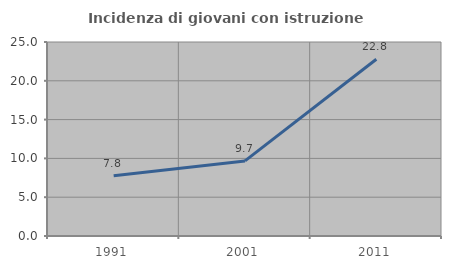
| Category | Incidenza di giovani con istruzione universitaria |
|---|---|
| 1991.0 | 7.755 |
| 2001.0 | 9.677 |
| 2011.0 | 22.772 |